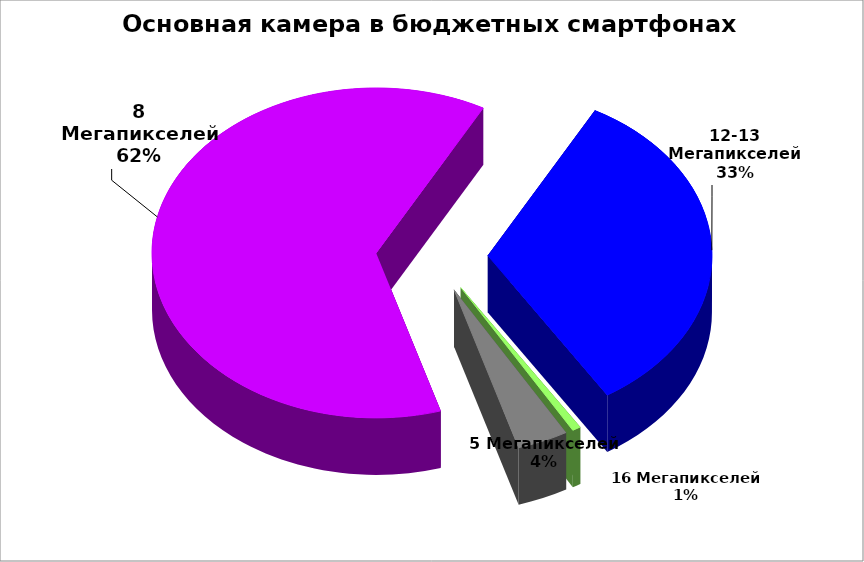
| Category | Series 0 |
|---|---|
| 5 Мегапикселей | 6 |
| 8 Мегапикселей | 102 |
| 12-13 Мегапикселей | 54 |
| 16 Мегапикселей | 1 |